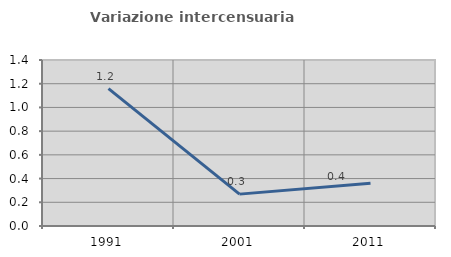
| Category | Variazione intercensuaria annua |
|---|---|
| 1991.0 | 1.159 |
| 2001.0 | 0.269 |
| 2011.0 | 0.361 |